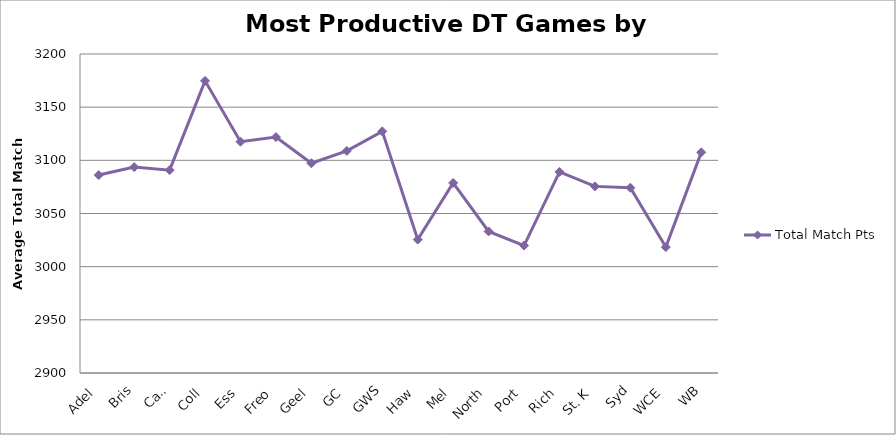
| Category | Total Match Pts |
|---|---|
| Adel | 3086.125 |
| Bris | 3093.625 |
| Carl | 3090.75 |
| Coll | 3174.75 |
| Ess | 3117.5 |
| Freo | 3121.875 |
| Geel | 3097.25 |
| GC | 3108.875 |
| GWS | 3127.25 |
| Haw | 3025.5 |
| Mel | 3078.75 |
| North | 3033.125 |
| Port | 3019.875 |
| Rich | 3089.125 |
| St. K | 3075.5 |
| Syd | 3074.25 |
| WCE | 3018.375 |
| WB | 3107.5 |